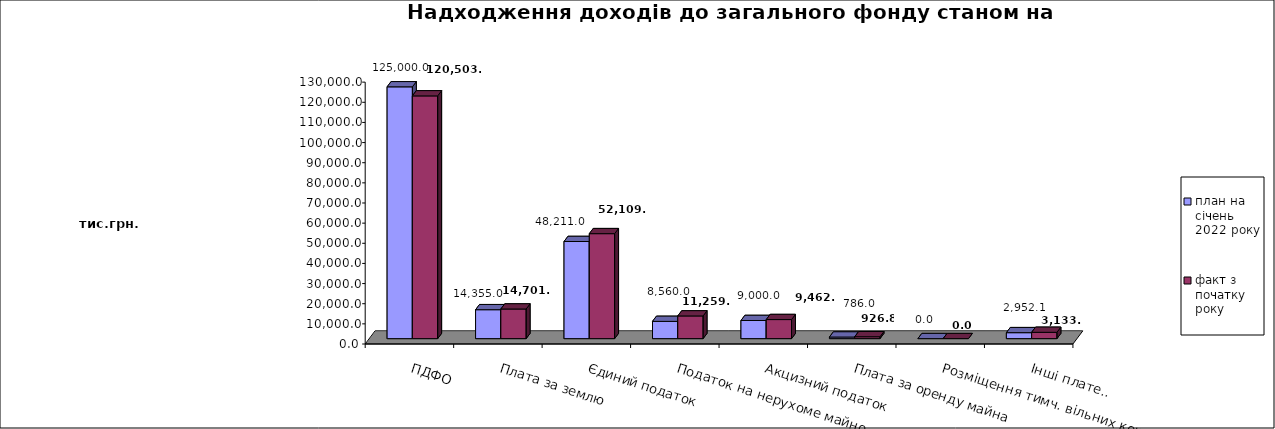
| Category | план на   січень 2022 року | факт з початку року |
|---|---|---|
| ПДФО | 125000 | 120503.94 |
| Плата за землю | 14355 | 14701.19 |
| Єдиний податок | 48211 | 52109.75 |
| Податок на нерухоме майно | 8560 | 11259.86 |
| Акцизний податок | 9000 | 9462.44 |
| Плата за оренду майна | 786 | 926.79 |
| Розміщення тимч. вільних коштів | 0 | 0 |
| Інші платежі | 2952.1 | 3133.299 |